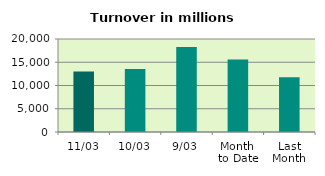
| Category | Series 0 |
|---|---|
| 11/03 | 13031.048 |
| 10/03 | 13524.455 |
| 9/03 | 18277.57 |
| Month 
to Date | 15579.665 |
| Last
Month | 11787.675 |